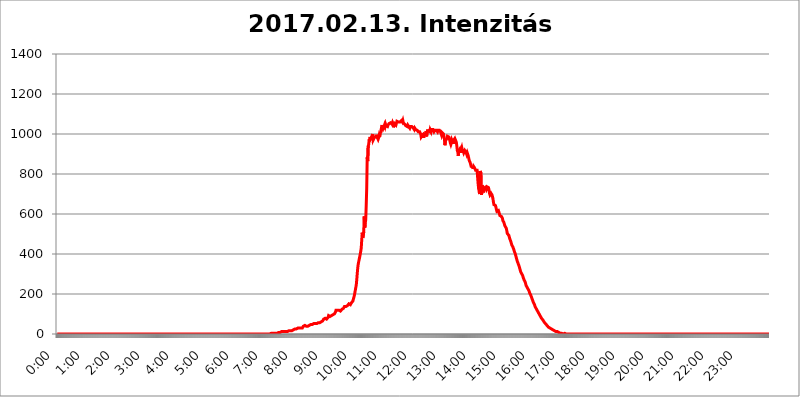
| Category | 2017.02.13. Intenzitás [W/m^2] |
|---|---|
| 0.0 | 0 |
| 0.0006944444444444445 | 0 |
| 0.001388888888888889 | 0 |
| 0.0020833333333333333 | 0 |
| 0.002777777777777778 | 0 |
| 0.003472222222222222 | 0 |
| 0.004166666666666667 | 0 |
| 0.004861111111111111 | 0 |
| 0.005555555555555556 | 0 |
| 0.0062499999999999995 | 0 |
| 0.006944444444444444 | 0 |
| 0.007638888888888889 | 0 |
| 0.008333333333333333 | 0 |
| 0.009027777777777779 | 0 |
| 0.009722222222222222 | 0 |
| 0.010416666666666666 | 0 |
| 0.011111111111111112 | 0 |
| 0.011805555555555555 | 0 |
| 0.012499999999999999 | 0 |
| 0.013194444444444444 | 0 |
| 0.013888888888888888 | 0 |
| 0.014583333333333332 | 0 |
| 0.015277777777777777 | 0 |
| 0.015972222222222224 | 0 |
| 0.016666666666666666 | 0 |
| 0.017361111111111112 | 0 |
| 0.018055555555555557 | 0 |
| 0.01875 | 0 |
| 0.019444444444444445 | 0 |
| 0.02013888888888889 | 0 |
| 0.020833333333333332 | 0 |
| 0.02152777777777778 | 0 |
| 0.022222222222222223 | 0 |
| 0.02291666666666667 | 0 |
| 0.02361111111111111 | 0 |
| 0.024305555555555556 | 0 |
| 0.024999999999999998 | 0 |
| 0.025694444444444447 | 0 |
| 0.02638888888888889 | 0 |
| 0.027083333333333334 | 0 |
| 0.027777777777777776 | 0 |
| 0.02847222222222222 | 0 |
| 0.029166666666666664 | 0 |
| 0.029861111111111113 | 0 |
| 0.030555555555555555 | 0 |
| 0.03125 | 0 |
| 0.03194444444444445 | 0 |
| 0.03263888888888889 | 0 |
| 0.03333333333333333 | 0 |
| 0.034027777777777775 | 0 |
| 0.034722222222222224 | 0 |
| 0.035416666666666666 | 0 |
| 0.036111111111111115 | 0 |
| 0.03680555555555556 | 0 |
| 0.0375 | 0 |
| 0.03819444444444444 | 0 |
| 0.03888888888888889 | 0 |
| 0.03958333333333333 | 0 |
| 0.04027777777777778 | 0 |
| 0.04097222222222222 | 0 |
| 0.041666666666666664 | 0 |
| 0.042361111111111106 | 0 |
| 0.04305555555555556 | 0 |
| 0.043750000000000004 | 0 |
| 0.044444444444444446 | 0 |
| 0.04513888888888889 | 0 |
| 0.04583333333333334 | 0 |
| 0.04652777777777778 | 0 |
| 0.04722222222222222 | 0 |
| 0.04791666666666666 | 0 |
| 0.04861111111111111 | 0 |
| 0.049305555555555554 | 0 |
| 0.049999999999999996 | 0 |
| 0.05069444444444445 | 0 |
| 0.051388888888888894 | 0 |
| 0.052083333333333336 | 0 |
| 0.05277777777777778 | 0 |
| 0.05347222222222222 | 0 |
| 0.05416666666666667 | 0 |
| 0.05486111111111111 | 0 |
| 0.05555555555555555 | 0 |
| 0.05625 | 0 |
| 0.05694444444444444 | 0 |
| 0.057638888888888885 | 0 |
| 0.05833333333333333 | 0 |
| 0.05902777777777778 | 0 |
| 0.059722222222222225 | 0 |
| 0.06041666666666667 | 0 |
| 0.061111111111111116 | 0 |
| 0.06180555555555556 | 0 |
| 0.0625 | 0 |
| 0.06319444444444444 | 0 |
| 0.06388888888888888 | 0 |
| 0.06458333333333334 | 0 |
| 0.06527777777777778 | 0 |
| 0.06597222222222222 | 0 |
| 0.06666666666666667 | 0 |
| 0.06736111111111111 | 0 |
| 0.06805555555555555 | 0 |
| 0.06874999999999999 | 0 |
| 0.06944444444444443 | 0 |
| 0.07013888888888889 | 0 |
| 0.07083333333333333 | 0 |
| 0.07152777777777779 | 0 |
| 0.07222222222222223 | 0 |
| 0.07291666666666667 | 0 |
| 0.07361111111111111 | 0 |
| 0.07430555555555556 | 0 |
| 0.075 | 0 |
| 0.07569444444444444 | 0 |
| 0.0763888888888889 | 0 |
| 0.07708333333333334 | 0 |
| 0.07777777777777778 | 0 |
| 0.07847222222222222 | 0 |
| 0.07916666666666666 | 0 |
| 0.0798611111111111 | 0 |
| 0.08055555555555556 | 0 |
| 0.08125 | 0 |
| 0.08194444444444444 | 0 |
| 0.08263888888888889 | 0 |
| 0.08333333333333333 | 0 |
| 0.08402777777777777 | 0 |
| 0.08472222222222221 | 0 |
| 0.08541666666666665 | 0 |
| 0.08611111111111112 | 0 |
| 0.08680555555555557 | 0 |
| 0.08750000000000001 | 0 |
| 0.08819444444444445 | 0 |
| 0.08888888888888889 | 0 |
| 0.08958333333333333 | 0 |
| 0.09027777777777778 | 0 |
| 0.09097222222222222 | 0 |
| 0.09166666666666667 | 0 |
| 0.09236111111111112 | 0 |
| 0.09305555555555556 | 0 |
| 0.09375 | 0 |
| 0.09444444444444444 | 0 |
| 0.09513888888888888 | 0 |
| 0.09583333333333333 | 0 |
| 0.09652777777777777 | 0 |
| 0.09722222222222222 | 0 |
| 0.09791666666666667 | 0 |
| 0.09861111111111111 | 0 |
| 0.09930555555555555 | 0 |
| 0.09999999999999999 | 0 |
| 0.10069444444444443 | 0 |
| 0.1013888888888889 | 0 |
| 0.10208333333333335 | 0 |
| 0.10277777777777779 | 0 |
| 0.10347222222222223 | 0 |
| 0.10416666666666667 | 0 |
| 0.10486111111111111 | 0 |
| 0.10555555555555556 | 0 |
| 0.10625 | 0 |
| 0.10694444444444444 | 0 |
| 0.1076388888888889 | 0 |
| 0.10833333333333334 | 0 |
| 0.10902777777777778 | 0 |
| 0.10972222222222222 | 0 |
| 0.1111111111111111 | 0 |
| 0.11180555555555556 | 0 |
| 0.11180555555555556 | 0 |
| 0.1125 | 0 |
| 0.11319444444444444 | 0 |
| 0.11388888888888889 | 0 |
| 0.11458333333333333 | 0 |
| 0.11527777777777777 | 0 |
| 0.11597222222222221 | 0 |
| 0.11666666666666665 | 0 |
| 0.1173611111111111 | 0 |
| 0.11805555555555557 | 0 |
| 0.11944444444444445 | 0 |
| 0.12013888888888889 | 0 |
| 0.12083333333333333 | 0 |
| 0.12152777777777778 | 0 |
| 0.12222222222222223 | 0 |
| 0.12291666666666667 | 0 |
| 0.12291666666666667 | 0 |
| 0.12361111111111112 | 0 |
| 0.12430555555555556 | 0 |
| 0.125 | 0 |
| 0.12569444444444444 | 0 |
| 0.12638888888888888 | 0 |
| 0.12708333333333333 | 0 |
| 0.16875 | 0 |
| 0.12847222222222224 | 0 |
| 0.12916666666666668 | 0 |
| 0.12986111111111112 | 0 |
| 0.13055555555555556 | 0 |
| 0.13125 | 0 |
| 0.13194444444444445 | 0 |
| 0.1326388888888889 | 0 |
| 0.13333333333333333 | 0 |
| 0.13402777777777777 | 0 |
| 0.13402777777777777 | 0 |
| 0.13472222222222222 | 0 |
| 0.13541666666666666 | 0 |
| 0.1361111111111111 | 0 |
| 0.13749999999999998 | 0 |
| 0.13819444444444443 | 0 |
| 0.1388888888888889 | 0 |
| 0.13958333333333334 | 0 |
| 0.14027777777777778 | 0 |
| 0.14097222222222222 | 0 |
| 0.14166666666666666 | 0 |
| 0.1423611111111111 | 0 |
| 0.14305555555555557 | 0 |
| 0.14375000000000002 | 0 |
| 0.14444444444444446 | 0 |
| 0.1451388888888889 | 0 |
| 0.1451388888888889 | 0 |
| 0.14652777777777778 | 0 |
| 0.14722222222222223 | 0 |
| 0.14791666666666667 | 0 |
| 0.1486111111111111 | 0 |
| 0.14930555555555555 | 0 |
| 0.15 | 0 |
| 0.15069444444444444 | 0 |
| 0.15138888888888888 | 0 |
| 0.15208333333333332 | 0 |
| 0.15277777777777776 | 0 |
| 0.15347222222222223 | 0 |
| 0.15416666666666667 | 0 |
| 0.15486111111111112 | 0 |
| 0.15555555555555556 | 0 |
| 0.15625 | 0 |
| 0.15694444444444444 | 0 |
| 0.15763888888888888 | 0 |
| 0.15833333333333333 | 0 |
| 0.15902777777777777 | 0 |
| 0.15972222222222224 | 0 |
| 0.16041666666666668 | 0 |
| 0.16111111111111112 | 0 |
| 0.16180555555555556 | 0 |
| 0.1625 | 0 |
| 0.16319444444444445 | 0 |
| 0.1638888888888889 | 0 |
| 0.16458333333333333 | 0 |
| 0.16527777777777777 | 0 |
| 0.16597222222222222 | 0 |
| 0.16666666666666666 | 0 |
| 0.1673611111111111 | 0 |
| 0.16805555555555554 | 0 |
| 0.16874999999999998 | 0 |
| 0.16944444444444443 | 0 |
| 0.17013888888888887 | 0 |
| 0.1708333333333333 | 0 |
| 0.17152777777777775 | 0 |
| 0.17222222222222225 | 0 |
| 0.1729166666666667 | 0 |
| 0.17361111111111113 | 0 |
| 0.17430555555555557 | 0 |
| 0.17500000000000002 | 0 |
| 0.17569444444444446 | 0 |
| 0.1763888888888889 | 0 |
| 0.17708333333333334 | 0 |
| 0.17777777777777778 | 0 |
| 0.17847222222222223 | 0 |
| 0.17916666666666667 | 0 |
| 0.1798611111111111 | 0 |
| 0.18055555555555555 | 0 |
| 0.18125 | 0 |
| 0.18194444444444444 | 0 |
| 0.1826388888888889 | 0 |
| 0.18333333333333335 | 0 |
| 0.1840277777777778 | 0 |
| 0.18472222222222223 | 0 |
| 0.18541666666666667 | 0 |
| 0.18611111111111112 | 0 |
| 0.18680555555555556 | 0 |
| 0.1875 | 0 |
| 0.18819444444444444 | 0 |
| 0.18888888888888888 | 0 |
| 0.18958333333333333 | 0 |
| 0.19027777777777777 | 0 |
| 0.1909722222222222 | 0 |
| 0.19166666666666665 | 0 |
| 0.19236111111111112 | 0 |
| 0.19305555555555554 | 0 |
| 0.19375 | 0 |
| 0.19444444444444445 | 0 |
| 0.1951388888888889 | 0 |
| 0.19583333333333333 | 0 |
| 0.19652777777777777 | 0 |
| 0.19722222222222222 | 0 |
| 0.19791666666666666 | 0 |
| 0.1986111111111111 | 0 |
| 0.19930555555555554 | 0 |
| 0.19999999999999998 | 0 |
| 0.20069444444444443 | 0 |
| 0.20138888888888887 | 0 |
| 0.2020833333333333 | 0 |
| 0.2027777777777778 | 0 |
| 0.2034722222222222 | 0 |
| 0.2041666666666667 | 0 |
| 0.20486111111111113 | 0 |
| 0.20555555555555557 | 0 |
| 0.20625000000000002 | 0 |
| 0.20694444444444446 | 0 |
| 0.2076388888888889 | 0 |
| 0.20833333333333334 | 0 |
| 0.20902777777777778 | 0 |
| 0.20972222222222223 | 0 |
| 0.21041666666666667 | 0 |
| 0.2111111111111111 | 0 |
| 0.21180555555555555 | 0 |
| 0.2125 | 0 |
| 0.21319444444444444 | 0 |
| 0.2138888888888889 | 0 |
| 0.21458333333333335 | 0 |
| 0.2152777777777778 | 0 |
| 0.21597222222222223 | 0 |
| 0.21666666666666667 | 0 |
| 0.21736111111111112 | 0 |
| 0.21805555555555556 | 0 |
| 0.21875 | 0 |
| 0.21944444444444444 | 0 |
| 0.22013888888888888 | 0 |
| 0.22083333333333333 | 0 |
| 0.22152777777777777 | 0 |
| 0.2222222222222222 | 0 |
| 0.22291666666666665 | 0 |
| 0.2236111111111111 | 0 |
| 0.22430555555555556 | 0 |
| 0.225 | 0 |
| 0.22569444444444445 | 0 |
| 0.2263888888888889 | 0 |
| 0.22708333333333333 | 0 |
| 0.22777777777777777 | 0 |
| 0.22847222222222222 | 0 |
| 0.22916666666666666 | 0 |
| 0.2298611111111111 | 0 |
| 0.23055555555555554 | 0 |
| 0.23124999999999998 | 0 |
| 0.23194444444444443 | 0 |
| 0.23263888888888887 | 0 |
| 0.2333333333333333 | 0 |
| 0.2340277777777778 | 0 |
| 0.2347222222222222 | 0 |
| 0.2354166666666667 | 0 |
| 0.23611111111111113 | 0 |
| 0.23680555555555557 | 0 |
| 0.23750000000000002 | 0 |
| 0.23819444444444446 | 0 |
| 0.2388888888888889 | 0 |
| 0.23958333333333334 | 0 |
| 0.24027777777777778 | 0 |
| 0.24097222222222223 | 0 |
| 0.24166666666666667 | 0 |
| 0.2423611111111111 | 0 |
| 0.24305555555555555 | 0 |
| 0.24375 | 0 |
| 0.24444444444444446 | 0 |
| 0.24513888888888888 | 0 |
| 0.24583333333333335 | 0 |
| 0.2465277777777778 | 0 |
| 0.24722222222222223 | 0 |
| 0.24791666666666667 | 0 |
| 0.24861111111111112 | 0 |
| 0.24930555555555556 | 0 |
| 0.25 | 0 |
| 0.25069444444444444 | 0 |
| 0.2513888888888889 | 0 |
| 0.2520833333333333 | 0 |
| 0.25277777777777777 | 0 |
| 0.2534722222222222 | 0 |
| 0.25416666666666665 | 0 |
| 0.2548611111111111 | 0 |
| 0.2555555555555556 | 0 |
| 0.25625000000000003 | 0 |
| 0.2569444444444445 | 0 |
| 0.2576388888888889 | 0 |
| 0.25833333333333336 | 0 |
| 0.2590277777777778 | 0 |
| 0.25972222222222224 | 0 |
| 0.2604166666666667 | 0 |
| 0.2611111111111111 | 0 |
| 0.26180555555555557 | 0 |
| 0.2625 | 0 |
| 0.26319444444444445 | 0 |
| 0.2638888888888889 | 0 |
| 0.26458333333333334 | 0 |
| 0.2652777777777778 | 0 |
| 0.2659722222222222 | 0 |
| 0.26666666666666666 | 0 |
| 0.2673611111111111 | 0 |
| 0.26805555555555555 | 0 |
| 0.26875 | 0 |
| 0.26944444444444443 | 0 |
| 0.2701388888888889 | 0 |
| 0.2708333333333333 | 0 |
| 0.27152777777777776 | 0 |
| 0.2722222222222222 | 0 |
| 0.27291666666666664 | 0 |
| 0.2736111111111111 | 0 |
| 0.2743055555555555 | 0 |
| 0.27499999999999997 | 0 |
| 0.27569444444444446 | 0 |
| 0.27638888888888885 | 0 |
| 0.27708333333333335 | 0 |
| 0.2777777777777778 | 0 |
| 0.27847222222222223 | 0 |
| 0.2791666666666667 | 0 |
| 0.2798611111111111 | 0 |
| 0.28055555555555556 | 0 |
| 0.28125 | 0 |
| 0.28194444444444444 | 0 |
| 0.2826388888888889 | 0 |
| 0.2833333333333333 | 0 |
| 0.28402777777777777 | 0 |
| 0.2847222222222222 | 0 |
| 0.28541666666666665 | 0 |
| 0.28611111111111115 | 0 |
| 0.28680555555555554 | 0 |
| 0.28750000000000003 | 0 |
| 0.2881944444444445 | 0 |
| 0.2888888888888889 | 0 |
| 0.28958333333333336 | 0 |
| 0.2902777777777778 | 0 |
| 0.29097222222222224 | 0 |
| 0.2916666666666667 | 0 |
| 0.2923611111111111 | 0 |
| 0.29305555555555557 | 0 |
| 0.29375 | 0 |
| 0.29444444444444445 | 0 |
| 0.2951388888888889 | 0 |
| 0.29583333333333334 | 0 |
| 0.2965277777777778 | 0 |
| 0.2972222222222222 | 3.525 |
| 0.29791666666666666 | 0 |
| 0.2986111111111111 | 3.525 |
| 0.29930555555555555 | 3.525 |
| 0.3 | 3.525 |
| 0.30069444444444443 | 3.525 |
| 0.3013888888888889 | 3.525 |
| 0.3020833333333333 | 3.525 |
| 0.30277777777777776 | 3.525 |
| 0.3034722222222222 | 3.525 |
| 0.30416666666666664 | 3.525 |
| 0.3048611111111111 | 3.525 |
| 0.3055555555555555 | 3.525 |
| 0.30624999999999997 | 3.525 |
| 0.3069444444444444 | 3.525 |
| 0.3076388888888889 | 3.525 |
| 0.30833333333333335 | 3.525 |
| 0.3090277777777778 | 3.525 |
| 0.30972222222222223 | 7.887 |
| 0.3104166666666667 | 7.887 |
| 0.3111111111111111 | 7.887 |
| 0.31180555555555556 | 7.887 |
| 0.3125 | 7.887 |
| 0.31319444444444444 | 7.887 |
| 0.3138888888888889 | 7.887 |
| 0.3145833333333333 | 12.257 |
| 0.31527777777777777 | 12.257 |
| 0.3159722222222222 | 12.257 |
| 0.31666666666666665 | 12.257 |
| 0.31736111111111115 | 12.257 |
| 0.31805555555555554 | 12.257 |
| 0.31875000000000003 | 12.257 |
| 0.3194444444444445 | 12.257 |
| 0.3201388888888889 | 12.257 |
| 0.32083333333333336 | 12.257 |
| 0.3215277777777778 | 12.257 |
| 0.32222222222222224 | 12.257 |
| 0.3229166666666667 | 12.257 |
| 0.3236111111111111 | 16.636 |
| 0.32430555555555557 | 12.257 |
| 0.325 | 16.636 |
| 0.32569444444444445 | 16.636 |
| 0.3263888888888889 | 16.636 |
| 0.32708333333333334 | 16.636 |
| 0.3277777777777778 | 16.636 |
| 0.3284722222222222 | 16.636 |
| 0.32916666666666666 | 16.636 |
| 0.3298611111111111 | 21.024 |
| 0.33055555555555555 | 21.024 |
| 0.33125 | 21.024 |
| 0.33194444444444443 | 21.024 |
| 0.3326388888888889 | 25.419 |
| 0.3333333333333333 | 25.419 |
| 0.3340277777777778 | 25.419 |
| 0.3347222222222222 | 25.419 |
| 0.3354166666666667 | 25.419 |
| 0.3361111111111111 | 29.823 |
| 0.3368055555555556 | 29.823 |
| 0.33749999999999997 | 29.823 |
| 0.33819444444444446 | 29.823 |
| 0.33888888888888885 | 29.823 |
| 0.33958333333333335 | 29.823 |
| 0.34027777777777773 | 29.823 |
| 0.34097222222222223 | 29.823 |
| 0.3416666666666666 | 29.823 |
| 0.3423611111111111 | 29.823 |
| 0.3430555555555555 | 29.823 |
| 0.34375 | 29.823 |
| 0.3444444444444445 | 34.234 |
| 0.3451388888888889 | 38.653 |
| 0.3458333333333334 | 38.653 |
| 0.34652777777777777 | 43.079 |
| 0.34722222222222227 | 43.079 |
| 0.34791666666666665 | 43.079 |
| 0.34861111111111115 | 38.653 |
| 0.34930555555555554 | 38.653 |
| 0.35000000000000003 | 38.653 |
| 0.3506944444444444 | 38.653 |
| 0.3513888888888889 | 38.653 |
| 0.3520833333333333 | 43.079 |
| 0.3527777777777778 | 43.079 |
| 0.3534722222222222 | 43.079 |
| 0.3541666666666667 | 47.511 |
| 0.3548611111111111 | 47.511 |
| 0.35555555555555557 | 47.511 |
| 0.35625 | 47.511 |
| 0.35694444444444445 | 47.511 |
| 0.3576388888888889 | 47.511 |
| 0.35833333333333334 | 51.951 |
| 0.3590277777777778 | 51.951 |
| 0.3597222222222222 | 51.951 |
| 0.36041666666666666 | 51.951 |
| 0.3611111111111111 | 51.951 |
| 0.36180555555555555 | 51.951 |
| 0.3625 | 51.951 |
| 0.36319444444444443 | 51.951 |
| 0.3638888888888889 | 51.951 |
| 0.3645833333333333 | 51.951 |
| 0.3652777777777778 | 51.951 |
| 0.3659722222222222 | 56.398 |
| 0.3666666666666667 | 56.398 |
| 0.3673611111111111 | 56.398 |
| 0.3680555555555556 | 56.398 |
| 0.36874999999999997 | 56.398 |
| 0.36944444444444446 | 56.398 |
| 0.37013888888888885 | 60.85 |
| 0.37083333333333335 | 60.85 |
| 0.37152777777777773 | 60.85 |
| 0.37222222222222223 | 65.31 |
| 0.3729166666666666 | 69.775 |
| 0.3736111111111111 | 74.246 |
| 0.3743055555555555 | 74.246 |
| 0.375 | 78.722 |
| 0.3756944444444445 | 78.722 |
| 0.3763888888888889 | 78.722 |
| 0.3770833333333334 | 78.722 |
| 0.37777777777777777 | 74.246 |
| 0.37847222222222227 | 74.246 |
| 0.37916666666666665 | 78.722 |
| 0.37986111111111115 | 83.205 |
| 0.38055555555555554 | 92.184 |
| 0.38125000000000003 | 92.184 |
| 0.3819444444444444 | 92.184 |
| 0.3826388888888889 | 87.692 |
| 0.3833333333333333 | 87.692 |
| 0.3840277777777778 | 87.692 |
| 0.3847222222222222 | 92.184 |
| 0.3854166666666667 | 92.184 |
| 0.3861111111111111 | 96.682 |
| 0.38680555555555557 | 96.682 |
| 0.3875 | 96.682 |
| 0.38819444444444445 | 101.184 |
| 0.3888888888888889 | 101.184 |
| 0.38958333333333334 | 105.69 |
| 0.3902777777777778 | 110.201 |
| 0.3909722222222222 | 119.235 |
| 0.39166666666666666 | 123.758 |
| 0.3923611111111111 | 119.235 |
| 0.39305555555555555 | 119.235 |
| 0.39375 | 119.235 |
| 0.39444444444444443 | 119.235 |
| 0.3951388888888889 | 119.235 |
| 0.3958333333333333 | 119.235 |
| 0.3965277777777778 | 114.716 |
| 0.3972222222222222 | 114.716 |
| 0.3979166666666667 | 114.716 |
| 0.3986111111111111 | 119.235 |
| 0.3993055555555556 | 123.758 |
| 0.39999999999999997 | 128.284 |
| 0.40069444444444446 | 128.284 |
| 0.40138888888888885 | 128.284 |
| 0.40208333333333335 | 132.814 |
| 0.40277777777777773 | 137.347 |
| 0.40347222222222223 | 137.347 |
| 0.4041666666666666 | 137.347 |
| 0.4048611111111111 | 137.347 |
| 0.4055555555555555 | 141.884 |
| 0.40625 | 141.884 |
| 0.4069444444444445 | 141.884 |
| 0.4076388888888889 | 141.884 |
| 0.4083333333333334 | 146.423 |
| 0.40902777777777777 | 150.964 |
| 0.40972222222222227 | 150.964 |
| 0.41041666666666665 | 146.423 |
| 0.41111111111111115 | 146.423 |
| 0.41180555555555554 | 150.964 |
| 0.41250000000000003 | 155.509 |
| 0.4131944444444444 | 155.509 |
| 0.4138888888888889 | 160.056 |
| 0.4145833333333333 | 164.605 |
| 0.4152777777777778 | 173.709 |
| 0.4159722222222222 | 182.82 |
| 0.4166666666666667 | 191.937 |
| 0.4173611111111111 | 205.62 |
| 0.41805555555555557 | 219.309 |
| 0.41875 | 233 |
| 0.41944444444444445 | 246.689 |
| 0.4201388888888889 | 274.047 |
| 0.42083333333333334 | 305.898 |
| 0.4215277777777778 | 333.113 |
| 0.4222222222222222 | 351.198 |
| 0.42291666666666666 | 351.198 |
| 0.4236111111111111 | 351.198 |
| 0.42430555555555555 | 387.202 |
| 0.425 | 391.685 |
| 0.42569444444444443 | 414.035 |
| 0.4263888888888889 | 431.833 |
| 0.4270833333333333 | 471.582 |
| 0.4277777777777778 | 506.542 |
| 0.4284722222222222 | 480.356 |
| 0.4291666666666667 | 484.735 |
| 0.4298611111111111 | 510.885 |
| 0.4305555555555556 | 588.009 |
| 0.43124999999999997 | 532.513 |
| 0.43194444444444446 | 553.986 |
| 0.43263888888888885 | 571.049 |
| 0.43333333333333335 | 642.4 |
| 0.43402777777777773 | 727.896 |
| 0.43472222222222223 | 883.516 |
| 0.4354166666666666 | 864.493 |
| 0.4361111111111111 | 940.082 |
| 0.4368055555555555 | 947.58 |
| 0.4375 | 973.772 |
| 0.4381944444444445 | 966.295 |
| 0.4388888888888889 | 984.98 |
| 0.4395833333333334 | 977.508 |
| 0.44027777777777777 | 981.244 |
| 0.44097222222222227 | 977.508 |
| 0.44166666666666665 | 992.448 |
| 0.44236111111111115 | 999.916 |
| 0.44305555555555554 | 970.034 |
| 0.44375000000000003 | 973.772 |
| 0.4444444444444444 | 966.295 |
| 0.4451388888888889 | 984.98 |
| 0.4458333333333333 | 984.98 |
| 0.4465277777777778 | 984.98 |
| 0.4472222222222222 | 984.98 |
| 0.4479166666666667 | 996.182 |
| 0.4486111111111111 | 984.98 |
| 0.44930555555555557 | 981.244 |
| 0.45 | 973.772 |
| 0.45069444444444445 | 981.244 |
| 0.4513888888888889 | 992.448 |
| 0.45208333333333334 | 984.98 |
| 0.4527777777777778 | 999.916 |
| 0.4534722222222222 | 1007.383 |
| 0.45416666666666666 | 1007.383 |
| 0.4548611111111111 | 1003.65 |
| 0.45555555555555555 | 1044.762 |
| 0.45625 | 1033.537 |
| 0.45694444444444443 | 1026.06 |
| 0.4576388888888889 | 1029.798 |
| 0.4583333333333333 | 1037.277 |
| 0.4590277777777778 | 1044.762 |
| 0.4597222222222222 | 1037.277 |
| 0.4604166666666667 | 1048.508 |
| 0.4611111111111111 | 1041.019 |
| 0.4618055555555556 | 1037.277 |
| 0.46249999999999997 | 1044.762 |
| 0.46319444444444446 | 1037.277 |
| 0.46388888888888885 | 1044.762 |
| 0.46458333333333335 | 1044.762 |
| 0.46527777777777773 | 1052.255 |
| 0.46597222222222223 | 1052.255 |
| 0.4666666666666666 | 1056.004 |
| 0.4673611111111111 | 1056.004 |
| 0.4680555555555555 | 1056.004 |
| 0.46875 | 1056.004 |
| 0.4694444444444445 | 1048.508 |
| 0.4701388888888889 | 1056.004 |
| 0.4708333333333334 | 1048.508 |
| 0.47152777777777777 | 1033.537 |
| 0.47222222222222227 | 1037.277 |
| 0.47291666666666665 | 1052.255 |
| 0.47361111111111115 | 1056.004 |
| 0.47430555555555554 | 1048.508 |
| 0.47500000000000003 | 1044.762 |
| 0.4756944444444444 | 1044.762 |
| 0.4763888888888889 | 1063.51 |
| 0.4770833333333333 | 1059.756 |
| 0.4777777777777778 | 1067.267 |
| 0.4784722222222222 | 1059.756 |
| 0.4791666666666667 | 1056.004 |
| 0.4798611111111111 | 1059.756 |
| 0.48055555555555557 | 1059.756 |
| 0.48125 | 1059.756 |
| 0.48194444444444445 | 1056.004 |
| 0.4826388888888889 | 1067.267 |
| 0.48333333333333334 | 1067.267 |
| 0.4840277777777778 | 1059.756 |
| 0.4847222222222222 | 1067.267 |
| 0.48541666666666666 | 1056.004 |
| 0.4861111111111111 | 1056.004 |
| 0.48680555555555555 | 1052.255 |
| 0.4875 | 1048.508 |
| 0.48819444444444443 | 1044.762 |
| 0.4888888888888889 | 1041.019 |
| 0.4895833333333333 | 1037.277 |
| 0.4902777777777778 | 1041.019 |
| 0.4909722222222222 | 1037.277 |
| 0.4916666666666667 | 1044.762 |
| 0.4923611111111111 | 1041.019 |
| 0.4930555555555556 | 1037.277 |
| 0.49374999999999997 | 1033.537 |
| 0.49444444444444446 | 1029.798 |
| 0.49513888888888885 | 1037.277 |
| 0.49583333333333335 | 1041.019 |
| 0.49652777777777773 | 1041.019 |
| 0.49722222222222223 | 1037.277 |
| 0.4979166666666666 | 1037.277 |
| 0.4986111111111111 | 1033.537 |
| 0.4993055555555555 | 1029.798 |
| 0.5 | 1026.06 |
| 0.5006944444444444 | 1022.323 |
| 0.5013888888888889 | 1029.798 |
| 0.5020833333333333 | 1026.06 |
| 0.5027777777777778 | 1022.323 |
| 0.5034722222222222 | 1018.587 |
| 0.5041666666666667 | 1026.06 |
| 0.5048611111111111 | 1018.587 |
| 0.5055555555555555 | 1014.852 |
| 0.50625 | 1011.118 |
| 0.5069444444444444 | 1007.383 |
| 0.5076388888888889 | 1014.852 |
| 0.5083333333333333 | 1011.118 |
| 0.5090277777777777 | 1007.383 |
| 0.5097222222222222 | 999.916 |
| 0.5104166666666666 | 984.98 |
| 0.5111111111111112 | 981.244 |
| 0.5118055555555555 | 992.448 |
| 0.5125000000000001 | 1003.65 |
| 0.5131944444444444 | 999.916 |
| 0.513888888888889 | 981.244 |
| 0.5145833333333333 | 999.916 |
| 0.5152777777777778 | 996.182 |
| 0.5159722222222222 | 999.916 |
| 0.5166666666666667 | 996.182 |
| 0.517361111111111 | 1014.852 |
| 0.5180555555555556 | 988.714 |
| 0.5187499999999999 | 1007.383 |
| 0.5194444444444445 | 1022.323 |
| 0.5201388888888888 | 1014.852 |
| 0.5208333333333334 | 1014.852 |
| 0.5215277777777778 | 1018.587 |
| 0.5222222222222223 | 1011.118 |
| 0.5229166666666667 | 1022.323 |
| 0.5236111111111111 | 1018.587 |
| 0.5243055555555556 | 1011.118 |
| 0.525 | 1022.323 |
| 0.5256944444444445 | 1022.323 |
| 0.5263888888888889 | 1018.587 |
| 0.5270833333333333 | 1022.323 |
| 0.5277777777777778 | 1018.587 |
| 0.5284722222222222 | 1011.118 |
| 0.5291666666666667 | 1007.383 |
| 0.5298611111111111 | 1018.587 |
| 0.5305555555555556 | 1022.323 |
| 0.53125 | 1022.323 |
| 0.5319444444444444 | 1018.587 |
| 0.5326388888888889 | 1014.852 |
| 0.5333333333333333 | 1011.118 |
| 0.5340277777777778 | 1018.587 |
| 0.5347222222222222 | 1018.587 |
| 0.5354166666666667 | 1018.587 |
| 0.5361111111111111 | 1018.587 |
| 0.5368055555555555 | 1022.323 |
| 0.5375 | 1011.118 |
| 0.5381944444444444 | 1003.65 |
| 0.5388888888888889 | 996.182 |
| 0.5395833333333333 | 1007.383 |
| 0.5402777777777777 | 1007.383 |
| 0.5409722222222222 | 1003.65 |
| 0.5416666666666666 | 999.916 |
| 0.5423611111111112 | 988.714 |
| 0.5430555555555555 | 973.772 |
| 0.5437500000000001 | 943.832 |
| 0.5444444444444444 | 966.295 |
| 0.545138888888889 | 970.034 |
| 0.5458333333333333 | 966.295 |
| 0.5465277777777778 | 977.508 |
| 0.5472222222222222 | 988.714 |
| 0.5479166666666667 | 988.714 |
| 0.548611111111111 | 984.98 |
| 0.5493055555555556 | 984.98 |
| 0.5499999999999999 | 981.244 |
| 0.5506944444444445 | 981.244 |
| 0.5513888888888888 | 955.071 |
| 0.5520833333333334 | 947.58 |
| 0.5527777777777778 | 955.071 |
| 0.5534722222222223 | 970.034 |
| 0.5541666666666667 | 966.295 |
| 0.5548611111111111 | 958.814 |
| 0.5555555555555556 | 951.327 |
| 0.55625 | 970.034 |
| 0.5569444444444445 | 970.034 |
| 0.5576388888888889 | 977.508 |
| 0.5583333333333333 | 981.244 |
| 0.5590277777777778 | 973.772 |
| 0.5597222222222222 | 958.814 |
| 0.5604166666666667 | 940.082 |
| 0.5611111111111111 | 917.534 |
| 0.5618055555555556 | 909.996 |
| 0.5625 | 891.099 |
| 0.5631944444444444 | 917.534 |
| 0.5638888888888889 | 921.298 |
| 0.5645833333333333 | 925.06 |
| 0.5652777777777778 | 913.766 |
| 0.5659722222222222 | 906.223 |
| 0.5666666666666667 | 925.06 |
| 0.5673611111111111 | 932.576 |
| 0.5680555555555555 | 921.298 |
| 0.56875 | 925.06 |
| 0.5694444444444444 | 913.766 |
| 0.5701388888888889 | 906.223 |
| 0.5708333333333333 | 902.447 |
| 0.5715277777777777 | 917.534 |
| 0.5722222222222222 | 921.298 |
| 0.5729166666666666 | 913.766 |
| 0.5736111111111112 | 906.223 |
| 0.5743055555555555 | 898.668 |
| 0.5750000000000001 | 906.223 |
| 0.5756944444444444 | 898.668 |
| 0.576388888888889 | 891.099 |
| 0.5770833333333333 | 879.719 |
| 0.5777777777777778 | 868.305 |
| 0.5784722222222222 | 864.493 |
| 0.5791666666666667 | 856.855 |
| 0.579861111111111 | 853.029 |
| 0.5805555555555556 | 837.682 |
| 0.5812499999999999 | 833.834 |
| 0.5819444444444445 | 837.682 |
| 0.5826388888888888 | 833.834 |
| 0.5833333333333334 | 826.123 |
| 0.5840277777777778 | 837.682 |
| 0.5847222222222223 | 837.682 |
| 0.5854166666666667 | 829.981 |
| 0.5861111111111111 | 826.123 |
| 0.5868055555555556 | 818.392 |
| 0.5875 | 822.26 |
| 0.5881944444444445 | 822.26 |
| 0.5888888888888889 | 818.392 |
| 0.5895833333333333 | 783.342 |
| 0.5902777777777778 | 751.803 |
| 0.5909722222222222 | 727.896 |
| 0.5916666666666667 | 727.896 |
| 0.5923611111111111 | 699.717 |
| 0.5930555555555556 | 814.519 |
| 0.59375 | 814.519 |
| 0.5944444444444444 | 802.868 |
| 0.5951388888888889 | 695.666 |
| 0.5958333333333333 | 743.859 |
| 0.5965277777777778 | 735.89 |
| 0.5972222222222222 | 715.858 |
| 0.5979166666666667 | 707.8 |
| 0.5986111111111111 | 719.877 |
| 0.5993055555555555 | 731.896 |
| 0.6 | 727.896 |
| 0.6006944444444444 | 735.89 |
| 0.6013888888888889 | 735.89 |
| 0.6020833333333333 | 727.896 |
| 0.6027777777777777 | 735.89 |
| 0.6034722222222222 | 739.877 |
| 0.6041666666666666 | 735.89 |
| 0.6048611111111112 | 731.896 |
| 0.6055555555555555 | 719.877 |
| 0.6062500000000001 | 703.762 |
| 0.6069444444444444 | 695.666 |
| 0.607638888888889 | 699.717 |
| 0.6083333333333333 | 703.762 |
| 0.6090277777777778 | 699.717 |
| 0.6097222222222222 | 695.666 |
| 0.6104166666666667 | 687.544 |
| 0.611111111111111 | 675.311 |
| 0.6118055555555556 | 658.909 |
| 0.6124999999999999 | 646.537 |
| 0.6131944444444445 | 642.4 |
| 0.6138888888888888 | 646.537 |
| 0.6145833333333334 | 642.4 |
| 0.6152777777777778 | 634.105 |
| 0.6159722222222223 | 621.613 |
| 0.6166666666666667 | 613.252 |
| 0.6173611111111111 | 613.252 |
| 0.6180555555555556 | 609.062 |
| 0.61875 | 617.436 |
| 0.6194444444444445 | 613.252 |
| 0.6201388888888889 | 600.661 |
| 0.6208333333333333 | 592.233 |
| 0.6215277777777778 | 588.009 |
| 0.6222222222222222 | 588.009 |
| 0.6229166666666667 | 588.009 |
| 0.6236111111111111 | 583.779 |
| 0.6243055555555556 | 579.542 |
| 0.625 | 566.793 |
| 0.6256944444444444 | 562.53 |
| 0.6263888888888889 | 558.261 |
| 0.6270833333333333 | 549.704 |
| 0.6277777777777778 | 541.121 |
| 0.6284722222222222 | 541.121 |
| 0.6291666666666667 | 536.82 |
| 0.6298611111111111 | 528.2 |
| 0.6305555555555555 | 515.223 |
| 0.63125 | 502.192 |
| 0.6319444444444444 | 497.836 |
| 0.6326388888888889 | 497.836 |
| 0.6333333333333333 | 493.475 |
| 0.6340277777777777 | 489.108 |
| 0.6347222222222222 | 475.972 |
| 0.6354166666666666 | 471.582 |
| 0.6361111111111112 | 462.786 |
| 0.6368055555555555 | 453.968 |
| 0.6375000000000001 | 445.129 |
| 0.6381944444444444 | 440.702 |
| 0.638888888888889 | 436.27 |
| 0.6395833333333333 | 431.833 |
| 0.6402777777777778 | 422.943 |
| 0.6409722222222222 | 414.035 |
| 0.6416666666666667 | 409.574 |
| 0.642361111111111 | 400.638 |
| 0.6430555555555556 | 396.164 |
| 0.6437499999999999 | 382.715 |
| 0.6444444444444445 | 373.729 |
| 0.6451388888888888 | 364.728 |
| 0.6458333333333334 | 360.221 |
| 0.6465277777777778 | 351.198 |
| 0.6472222222222223 | 346.682 |
| 0.6479166666666667 | 337.639 |
| 0.6486111111111111 | 328.584 |
| 0.6493055555555556 | 319.517 |
| 0.65 | 310.44 |
| 0.6506944444444445 | 305.898 |
| 0.6513888888888889 | 301.354 |
| 0.6520833333333333 | 296.808 |
| 0.6527777777777778 | 292.259 |
| 0.6534722222222222 | 283.156 |
| 0.6541666666666667 | 278.603 |
| 0.6548611111111111 | 269.49 |
| 0.6555555555555556 | 264.932 |
| 0.65625 | 260.373 |
| 0.6569444444444444 | 251.251 |
| 0.6576388888888889 | 242.127 |
| 0.6583333333333333 | 237.564 |
| 0.6590277777777778 | 233 |
| 0.6597222222222222 | 228.436 |
| 0.6604166666666667 | 223.873 |
| 0.6611111111111111 | 219.309 |
| 0.6618055555555555 | 214.746 |
| 0.6625 | 205.62 |
| 0.6631944444444444 | 201.058 |
| 0.6638888888888889 | 196.497 |
| 0.6645833333333333 | 191.937 |
| 0.6652777777777777 | 182.82 |
| 0.6659722222222222 | 178.264 |
| 0.6666666666666666 | 169.156 |
| 0.6673611111111111 | 164.605 |
| 0.6680555555555556 | 155.509 |
| 0.6687500000000001 | 150.964 |
| 0.6694444444444444 | 146.423 |
| 0.6701388888888888 | 137.347 |
| 0.6708333333333334 | 137.347 |
| 0.6715277777777778 | 132.814 |
| 0.6722222222222222 | 123.758 |
| 0.6729166666666666 | 119.235 |
| 0.6736111111111112 | 114.716 |
| 0.6743055555555556 | 110.201 |
| 0.6749999999999999 | 105.69 |
| 0.6756944444444444 | 101.184 |
| 0.6763888888888889 | 96.682 |
| 0.6770833333333334 | 92.184 |
| 0.6777777777777777 | 87.692 |
| 0.6784722222222223 | 83.205 |
| 0.6791666666666667 | 78.722 |
| 0.6798611111111111 | 74.246 |
| 0.6805555555555555 | 74.246 |
| 0.68125 | 69.775 |
| 0.6819444444444445 | 65.31 |
| 0.6826388888888889 | 60.85 |
| 0.6833333333333332 | 56.398 |
| 0.6840277777777778 | 56.398 |
| 0.6847222222222222 | 51.951 |
| 0.6854166666666667 | 47.511 |
| 0.686111111111111 | 47.511 |
| 0.6868055555555556 | 43.079 |
| 0.6875 | 38.653 |
| 0.6881944444444444 | 38.653 |
| 0.688888888888889 | 34.234 |
| 0.6895833333333333 | 34.234 |
| 0.6902777777777778 | 34.234 |
| 0.6909722222222222 | 29.823 |
| 0.6916666666666668 | 29.823 |
| 0.6923611111111111 | 25.419 |
| 0.6930555555555555 | 25.419 |
| 0.69375 | 25.419 |
| 0.6944444444444445 | 21.024 |
| 0.6951388888888889 | 21.024 |
| 0.6958333333333333 | 21.024 |
| 0.6965277777777777 | 16.636 |
| 0.6972222222222223 | 16.636 |
| 0.6979166666666666 | 16.636 |
| 0.6986111111111111 | 12.257 |
| 0.6993055555555556 | 12.257 |
| 0.7000000000000001 | 12.257 |
| 0.7006944444444444 | 12.257 |
| 0.7013888888888888 | 12.257 |
| 0.7020833333333334 | 7.887 |
| 0.7027777777777778 | 7.887 |
| 0.7034722222222222 | 7.887 |
| 0.7041666666666666 | 7.887 |
| 0.7048611111111112 | 3.525 |
| 0.7055555555555556 | 3.525 |
| 0.7062499999999999 | 3.525 |
| 0.7069444444444444 | 3.525 |
| 0.7076388888888889 | 3.525 |
| 0.7083333333333334 | 3.525 |
| 0.7090277777777777 | 3.525 |
| 0.7097222222222223 | 0 |
| 0.7104166666666667 | 3.525 |
| 0.7111111111111111 | 3.525 |
| 0.7118055555555555 | 3.525 |
| 0.7125 | 0 |
| 0.7131944444444445 | 0 |
| 0.7138888888888889 | 0 |
| 0.7145833333333332 | 0 |
| 0.7152777777777778 | 0 |
| 0.7159722222222222 | 0 |
| 0.7166666666666667 | 0 |
| 0.717361111111111 | 0 |
| 0.7180555555555556 | 0 |
| 0.71875 | 0 |
| 0.7194444444444444 | 0 |
| 0.720138888888889 | 0 |
| 0.7208333333333333 | 0 |
| 0.7215277777777778 | 0 |
| 0.7222222222222222 | 0 |
| 0.7229166666666668 | 0 |
| 0.7236111111111111 | 0 |
| 0.7243055555555555 | 0 |
| 0.725 | 0 |
| 0.7256944444444445 | 0 |
| 0.7263888888888889 | 0 |
| 0.7270833333333333 | 0 |
| 0.7277777777777777 | 0 |
| 0.7284722222222223 | 0 |
| 0.7291666666666666 | 0 |
| 0.7298611111111111 | 0 |
| 0.7305555555555556 | 0 |
| 0.7312500000000001 | 0 |
| 0.7319444444444444 | 0 |
| 0.7326388888888888 | 0 |
| 0.7333333333333334 | 0 |
| 0.7340277777777778 | 0 |
| 0.7347222222222222 | 0 |
| 0.7354166666666666 | 0 |
| 0.7361111111111112 | 0 |
| 0.7368055555555556 | 0 |
| 0.7374999999999999 | 0 |
| 0.7381944444444444 | 0 |
| 0.7388888888888889 | 0 |
| 0.7395833333333334 | 0 |
| 0.7402777777777777 | 0 |
| 0.7409722222222223 | 0 |
| 0.7416666666666667 | 0 |
| 0.7423611111111111 | 0 |
| 0.7430555555555555 | 0 |
| 0.74375 | 0 |
| 0.7444444444444445 | 0 |
| 0.7451388888888889 | 0 |
| 0.7458333333333332 | 0 |
| 0.7465277777777778 | 0 |
| 0.7472222222222222 | 0 |
| 0.7479166666666667 | 0 |
| 0.748611111111111 | 0 |
| 0.7493055555555556 | 0 |
| 0.75 | 0 |
| 0.7506944444444444 | 0 |
| 0.751388888888889 | 0 |
| 0.7520833333333333 | 0 |
| 0.7527777777777778 | 0 |
| 0.7534722222222222 | 0 |
| 0.7541666666666668 | 0 |
| 0.7548611111111111 | 0 |
| 0.7555555555555555 | 0 |
| 0.75625 | 0 |
| 0.7569444444444445 | 0 |
| 0.7576388888888889 | 0 |
| 0.7583333333333333 | 0 |
| 0.7590277777777777 | 0 |
| 0.7597222222222223 | 0 |
| 0.7604166666666666 | 0 |
| 0.7611111111111111 | 0 |
| 0.7618055555555556 | 0 |
| 0.7625000000000001 | 0 |
| 0.7631944444444444 | 0 |
| 0.7638888888888888 | 0 |
| 0.7645833333333334 | 0 |
| 0.7652777777777778 | 0 |
| 0.7659722222222222 | 0 |
| 0.7666666666666666 | 0 |
| 0.7673611111111112 | 0 |
| 0.7680555555555556 | 0 |
| 0.7687499999999999 | 0 |
| 0.7694444444444444 | 0 |
| 0.7701388888888889 | 0 |
| 0.7708333333333334 | 0 |
| 0.7715277777777777 | 0 |
| 0.7722222222222223 | 0 |
| 0.7729166666666667 | 0 |
| 0.7736111111111111 | 0 |
| 0.7743055555555555 | 0 |
| 0.775 | 0 |
| 0.7756944444444445 | 0 |
| 0.7763888888888889 | 0 |
| 0.7770833333333332 | 0 |
| 0.7777777777777778 | 0 |
| 0.7784722222222222 | 0 |
| 0.7791666666666667 | 0 |
| 0.779861111111111 | 0 |
| 0.7805555555555556 | 0 |
| 0.78125 | 0 |
| 0.7819444444444444 | 0 |
| 0.782638888888889 | 0 |
| 0.7833333333333333 | 0 |
| 0.7840277777777778 | 0 |
| 0.7847222222222222 | 0 |
| 0.7854166666666668 | 0 |
| 0.7861111111111111 | 0 |
| 0.7868055555555555 | 0 |
| 0.7875 | 0 |
| 0.7881944444444445 | 0 |
| 0.7888888888888889 | 0 |
| 0.7895833333333333 | 0 |
| 0.7902777777777777 | 0 |
| 0.7909722222222223 | 0 |
| 0.7916666666666666 | 0 |
| 0.7923611111111111 | 0 |
| 0.7930555555555556 | 0 |
| 0.7937500000000001 | 0 |
| 0.7944444444444444 | 0 |
| 0.7951388888888888 | 0 |
| 0.7958333333333334 | 0 |
| 0.7965277777777778 | 0 |
| 0.7972222222222222 | 0 |
| 0.7979166666666666 | 0 |
| 0.7986111111111112 | 0 |
| 0.7993055555555556 | 0 |
| 0.7999999999999999 | 0 |
| 0.8006944444444444 | 0 |
| 0.8013888888888889 | 0 |
| 0.8020833333333334 | 0 |
| 0.8027777777777777 | 0 |
| 0.8034722222222223 | 0 |
| 0.8041666666666667 | 0 |
| 0.8048611111111111 | 0 |
| 0.8055555555555555 | 0 |
| 0.80625 | 0 |
| 0.8069444444444445 | 0 |
| 0.8076388888888889 | 0 |
| 0.8083333333333332 | 0 |
| 0.8090277777777778 | 0 |
| 0.8097222222222222 | 0 |
| 0.8104166666666667 | 0 |
| 0.811111111111111 | 0 |
| 0.8118055555555556 | 0 |
| 0.8125 | 0 |
| 0.8131944444444444 | 0 |
| 0.813888888888889 | 0 |
| 0.8145833333333333 | 0 |
| 0.8152777777777778 | 0 |
| 0.8159722222222222 | 0 |
| 0.8166666666666668 | 0 |
| 0.8173611111111111 | 0 |
| 0.8180555555555555 | 0 |
| 0.81875 | 0 |
| 0.8194444444444445 | 0 |
| 0.8201388888888889 | 0 |
| 0.8208333333333333 | 0 |
| 0.8215277777777777 | 0 |
| 0.8222222222222223 | 0 |
| 0.8229166666666666 | 0 |
| 0.8236111111111111 | 0 |
| 0.8243055555555556 | 0 |
| 0.8250000000000001 | 0 |
| 0.8256944444444444 | 0 |
| 0.8263888888888888 | 0 |
| 0.8270833333333334 | 0 |
| 0.8277777777777778 | 0 |
| 0.8284722222222222 | 0 |
| 0.8291666666666666 | 0 |
| 0.8298611111111112 | 0 |
| 0.8305555555555556 | 0 |
| 0.8312499999999999 | 0 |
| 0.8319444444444444 | 0 |
| 0.8326388888888889 | 0 |
| 0.8333333333333334 | 0 |
| 0.8340277777777777 | 0 |
| 0.8347222222222223 | 0 |
| 0.8354166666666667 | 0 |
| 0.8361111111111111 | 0 |
| 0.8368055555555555 | 0 |
| 0.8375 | 0 |
| 0.8381944444444445 | 0 |
| 0.8388888888888889 | 0 |
| 0.8395833333333332 | 0 |
| 0.8402777777777778 | 0 |
| 0.8409722222222222 | 0 |
| 0.8416666666666667 | 0 |
| 0.842361111111111 | 0 |
| 0.8430555555555556 | 0 |
| 0.84375 | 0 |
| 0.8444444444444444 | 0 |
| 0.845138888888889 | 0 |
| 0.8458333333333333 | 0 |
| 0.8465277777777778 | 0 |
| 0.8472222222222222 | 0 |
| 0.8479166666666668 | 0 |
| 0.8486111111111111 | 0 |
| 0.8493055555555555 | 0 |
| 0.85 | 0 |
| 0.8506944444444445 | 0 |
| 0.8513888888888889 | 0 |
| 0.8520833333333333 | 0 |
| 0.8527777777777777 | 0 |
| 0.8534722222222223 | 0 |
| 0.8541666666666666 | 0 |
| 0.8548611111111111 | 0 |
| 0.8555555555555556 | 0 |
| 0.8562500000000001 | 0 |
| 0.8569444444444444 | 0 |
| 0.8576388888888888 | 0 |
| 0.8583333333333334 | 0 |
| 0.8590277777777778 | 0 |
| 0.8597222222222222 | 0 |
| 0.8604166666666666 | 0 |
| 0.8611111111111112 | 0 |
| 0.8618055555555556 | 0 |
| 0.8624999999999999 | 0 |
| 0.8631944444444444 | 0 |
| 0.8638888888888889 | 0 |
| 0.8645833333333334 | 0 |
| 0.8652777777777777 | 0 |
| 0.8659722222222223 | 0 |
| 0.8666666666666667 | 0 |
| 0.8673611111111111 | 0 |
| 0.8680555555555555 | 0 |
| 0.86875 | 0 |
| 0.8694444444444445 | 0 |
| 0.8701388888888889 | 0 |
| 0.8708333333333332 | 0 |
| 0.8715277777777778 | 0 |
| 0.8722222222222222 | 0 |
| 0.8729166666666667 | 0 |
| 0.873611111111111 | 0 |
| 0.8743055555555556 | 0 |
| 0.875 | 0 |
| 0.8756944444444444 | 0 |
| 0.876388888888889 | 0 |
| 0.8770833333333333 | 0 |
| 0.8777777777777778 | 0 |
| 0.8784722222222222 | 0 |
| 0.8791666666666668 | 0 |
| 0.8798611111111111 | 0 |
| 0.8805555555555555 | 0 |
| 0.88125 | 0 |
| 0.8819444444444445 | 0 |
| 0.8826388888888889 | 0 |
| 0.8833333333333333 | 0 |
| 0.8840277777777777 | 0 |
| 0.8847222222222223 | 0 |
| 0.8854166666666666 | 0 |
| 0.8861111111111111 | 0 |
| 0.8868055555555556 | 0 |
| 0.8875000000000001 | 0 |
| 0.8881944444444444 | 0 |
| 0.8888888888888888 | 0 |
| 0.8895833333333334 | 0 |
| 0.8902777777777778 | 0 |
| 0.8909722222222222 | 0 |
| 0.8916666666666666 | 0 |
| 0.8923611111111112 | 0 |
| 0.8930555555555556 | 0 |
| 0.8937499999999999 | 0 |
| 0.8944444444444444 | 0 |
| 0.8951388888888889 | 0 |
| 0.8958333333333334 | 0 |
| 0.8965277777777777 | 0 |
| 0.8972222222222223 | 0 |
| 0.8979166666666667 | 0 |
| 0.8986111111111111 | 0 |
| 0.8993055555555555 | 0 |
| 0.9 | 0 |
| 0.9006944444444445 | 0 |
| 0.9013888888888889 | 0 |
| 0.9020833333333332 | 0 |
| 0.9027777777777778 | 0 |
| 0.9034722222222222 | 0 |
| 0.9041666666666667 | 0 |
| 0.904861111111111 | 0 |
| 0.9055555555555556 | 0 |
| 0.90625 | 0 |
| 0.9069444444444444 | 0 |
| 0.907638888888889 | 0 |
| 0.9083333333333333 | 0 |
| 0.9090277777777778 | 0 |
| 0.9097222222222222 | 0 |
| 0.9104166666666668 | 0 |
| 0.9111111111111111 | 0 |
| 0.9118055555555555 | 0 |
| 0.9125 | 0 |
| 0.9131944444444445 | 0 |
| 0.9138888888888889 | 0 |
| 0.9145833333333333 | 0 |
| 0.9152777777777777 | 0 |
| 0.9159722222222223 | 0 |
| 0.9166666666666666 | 0 |
| 0.9173611111111111 | 0 |
| 0.9180555555555556 | 0 |
| 0.9187500000000001 | 0 |
| 0.9194444444444444 | 0 |
| 0.9201388888888888 | 0 |
| 0.9208333333333334 | 0 |
| 0.9215277777777778 | 0 |
| 0.9222222222222222 | 0 |
| 0.9229166666666666 | 0 |
| 0.9236111111111112 | 0 |
| 0.9243055555555556 | 0 |
| 0.9249999999999999 | 0 |
| 0.9256944444444444 | 0 |
| 0.9263888888888889 | 0 |
| 0.9270833333333334 | 0 |
| 0.9277777777777777 | 0 |
| 0.9284722222222223 | 0 |
| 0.9291666666666667 | 0 |
| 0.9298611111111111 | 0 |
| 0.9305555555555555 | 0 |
| 0.93125 | 0 |
| 0.9319444444444445 | 0 |
| 0.9326388888888889 | 0 |
| 0.9333333333333332 | 0 |
| 0.9340277777777778 | 0 |
| 0.9347222222222222 | 0 |
| 0.9354166666666667 | 0 |
| 0.936111111111111 | 0 |
| 0.9368055555555556 | 0 |
| 0.9375 | 0 |
| 0.9381944444444444 | 0 |
| 0.938888888888889 | 0 |
| 0.9395833333333333 | 0 |
| 0.9402777777777778 | 0 |
| 0.9409722222222222 | 0 |
| 0.9416666666666668 | 0 |
| 0.9423611111111111 | 0 |
| 0.9430555555555555 | 0 |
| 0.94375 | 0 |
| 0.9444444444444445 | 0 |
| 0.9451388888888889 | 0 |
| 0.9458333333333333 | 0 |
| 0.9465277777777777 | 0 |
| 0.9472222222222223 | 0 |
| 0.9479166666666666 | 0 |
| 0.9486111111111111 | 0 |
| 0.9493055555555556 | 0 |
| 0.9500000000000001 | 0 |
| 0.9506944444444444 | 0 |
| 0.9513888888888888 | 0 |
| 0.9520833333333334 | 0 |
| 0.9527777777777778 | 0 |
| 0.9534722222222222 | 0 |
| 0.9541666666666666 | 0 |
| 0.9548611111111112 | 0 |
| 0.9555555555555556 | 0 |
| 0.9562499999999999 | 0 |
| 0.9569444444444444 | 0 |
| 0.9576388888888889 | 0 |
| 0.9583333333333334 | 0 |
| 0.9590277777777777 | 0 |
| 0.9597222222222223 | 0 |
| 0.9604166666666667 | 0 |
| 0.9611111111111111 | 0 |
| 0.9618055555555555 | 0 |
| 0.9625 | 0 |
| 0.9631944444444445 | 0 |
| 0.9638888888888889 | 0 |
| 0.9645833333333332 | 0 |
| 0.9652777777777778 | 0 |
| 0.9659722222222222 | 0 |
| 0.9666666666666667 | 0 |
| 0.967361111111111 | 0 |
| 0.9680555555555556 | 0 |
| 0.96875 | 0 |
| 0.9694444444444444 | 0 |
| 0.970138888888889 | 0 |
| 0.9708333333333333 | 0 |
| 0.9715277777777778 | 0 |
| 0.9722222222222222 | 0 |
| 0.9729166666666668 | 0 |
| 0.9736111111111111 | 0 |
| 0.9743055555555555 | 0 |
| 0.975 | 0 |
| 0.9756944444444445 | 0 |
| 0.9763888888888889 | 0 |
| 0.9770833333333333 | 0 |
| 0.9777777777777777 | 0 |
| 0.9784722222222223 | 0 |
| 0.9791666666666666 | 0 |
| 0.9798611111111111 | 0 |
| 0.9805555555555556 | 0 |
| 0.9812500000000001 | 0 |
| 0.9819444444444444 | 0 |
| 0.9826388888888888 | 0 |
| 0.9833333333333334 | 0 |
| 0.9840277777777778 | 0 |
| 0.9847222222222222 | 0 |
| 0.9854166666666666 | 0 |
| 0.9861111111111112 | 0 |
| 0.9868055555555556 | 0 |
| 0.9874999999999999 | 0 |
| 0.9881944444444444 | 0 |
| 0.9888888888888889 | 0 |
| 0.9895833333333334 | 0 |
| 0.9902777777777777 | 0 |
| 0.9909722222222223 | 0 |
| 0.9916666666666667 | 0 |
| 0.9923611111111111 | 0 |
| 0.9930555555555555 | 0 |
| 0.99375 | 0 |
| 0.9944444444444445 | 0 |
| 0.9951388888888889 | 0 |
| 0.9958333333333332 | 0 |
| 0.9965277777777778 | 0 |
| 0.9972222222222222 | 0 |
| 0.9979166666666667 | 0 |
| 0.998611111111111 | 0 |
| 0.9993055555555556 | 0 |